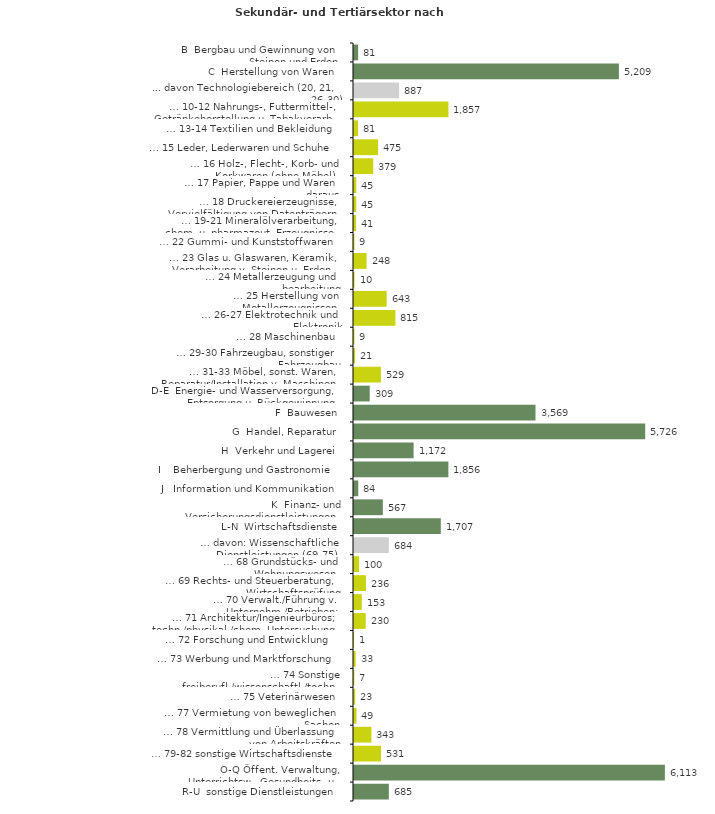
| Category | Series 0 |
|---|---|
| B  Bergbau und Gewinnung von Steinen und Erden | 81 |
| C  Herstellung von Waren | 5209 |
| ... davon Technologiebereich (20, 21, 26-30) | 887 |
| … 10-12 Nahrungs-, Futtermittel-, Getränkeherstellung u. Tabakverarb. | 1857 |
| … 13-14 Textilien und Bekleidung | 81 |
| … 15 Leder, Lederwaren und Schuhe | 475 |
| … 16 Holz-, Flecht-, Korb- und Korkwaren (ohne Möbel)  | 379 |
| … 17 Papier, Pappe und Waren daraus  | 45 |
| … 18 Druckereierzeugnisse, Vervielfältigung von Datenträgern | 45 |
| … 19-21 Mineralölverarbeitung, chem. u. pharmazeut. Erzeugnisse | 41 |
| … 22 Gummi- und Kunststoffwaren | 9 |
| … 23 Glas u. Glaswaren, Keramik, Verarbeitung v. Steinen u. Erden  | 248 |
| … 24 Metallerzeugung und -bearbeitung | 10 |
| … 25 Herstellung von Metallerzeugnissen  | 643 |
| … 26-27 Elektrotechnik und Elektronik | 815 |
| … 28 Maschinenbau | 9 |
| … 29-30 Fahrzeugbau, sonstiger Fahrzeugbau | 21 |
| … 31-33 Möbel, sonst. Waren, Reparatur/Installation v. Maschinen | 529 |
| D-E  Energie- und Wasserversorgung, Entsorgung u. Rückgewinnung | 309 |
| F  Bauwesen | 3569 |
| G  Handel, Reparatur | 5726 |
| H  Verkehr und Lagerei | 1172 |
| I    Beherbergung und Gastronomie | 1856 |
| J   Information und Kommunikation | 84 |
| K  Finanz- und Versicherungsdienstleistungen | 567 |
| L-N  Wirtschaftsdienste | 1707 |
| … davon: Wissenschaftliche Dienstleistungen (69-75) | 684 |
| … 68 Grundstücks- und Wohnungswesen  | 100 |
| … 69 Rechts- und Steuerberatung, Wirtschaftsprüfung | 236 |
| … 70 Verwalt./Führung v. Unternehm./Betrieben; Unternehmensberat. | 153 |
| … 71 Architektur/Ingenieurbüros; techn./physikal./chem. Untersuchung | 230 |
| … 72 Forschung und Entwicklung  | 1 |
| … 73 Werbung und Marktforschung | 33 |
| … 74 Sonstige freiberufl./wissenschaftl./techn. Tätigkeiten | 7 |
| … 75 Veterinärwesen | 23 |
| … 77 Vermietung von beweglichen Sachen  | 49 |
| … 78 Vermittlung und Überlassung von Arbeitskräften | 343 |
| … 79-82 sonstige Wirtschaftsdienste | 531 |
| O-Q Öffent. Verwaltung, Unterrichtsw., Gesundheits- u. Sozialwesen | 6113 |
| R-U  sonstige Dienstleistungen | 685 |